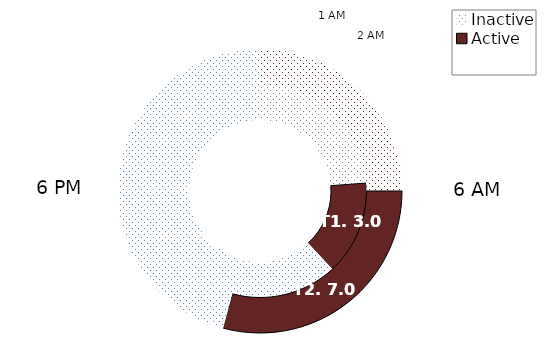
| Category | T1 | T2 | T3 | T4 | T5 | T6 |
|---|---|---|---|---|---|---|
| Inactive | 1900-01-05 | 6 |  |  |  |  |
| Active | 1900-01-03 | 7 |  |  |  |  |
| Inactive | 1900-01-13 | 11 |  |  |  |  |